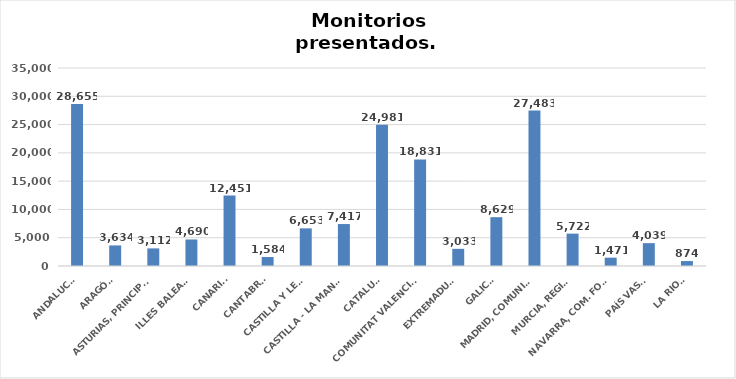
| Category | Series 0 |
|---|---|
| ANDALUCÍA | 28655 |
| ARAGÓN | 3634 |
| ASTURIAS, PRINCIPADO | 3112 |
| ILLES BALEARS | 4690 |
| CANARIAS | 12451 |
| CANTABRIA | 1584 |
| CASTILLA Y LEÓN | 6653 |
| CASTILLA - LA MANCHA | 7417 |
| CATALUÑA | 24981 |
| COMUNITAT VALENCIANA | 18831 |
| EXTREMADURA | 3033 |
| GALICIA | 8629 |
| MADRID, COMUNIDAD | 27483 |
| MURCIA, REGIÓN | 5722 |
| NAVARRA, COM. FORAL | 1471 |
| PAÍS VASCO | 4039 |
| LA RIOJA | 874 |